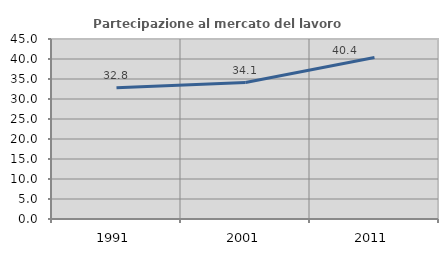
| Category | Partecipazione al mercato del lavoro  femminile |
|---|---|
| 1991.0 | 32.836 |
| 2001.0 | 34.105 |
| 2011.0 | 40.363 |